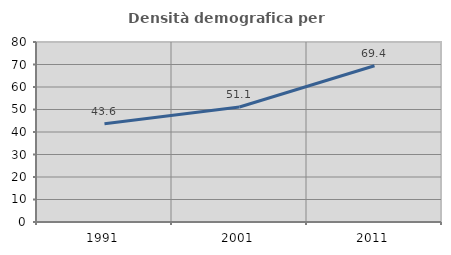
| Category | Densità demografica |
|---|---|
| 1991.0 | 43.623 |
| 2001.0 | 51.111 |
| 2011.0 | 69.44 |